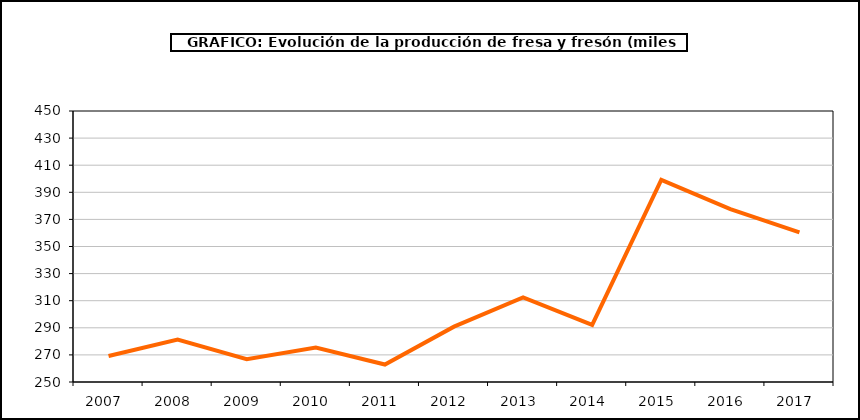
| Category | producción |
|---|---|
| 2007.0 | 269.139 |
| 2008.0 | 281.24 |
| 2009.0 | 266.772 |
| 2010.0 | 275.355 |
| 2011.0 | 262.896 |
| 2012.0 | 290.843 |
| 2013.0 | 312.466 |
| 2014.0 | 292.101 |
| 2015.0 | 399.217 |
| 2016.0 | 377.596 |
| 2017.0 | 360.416 |